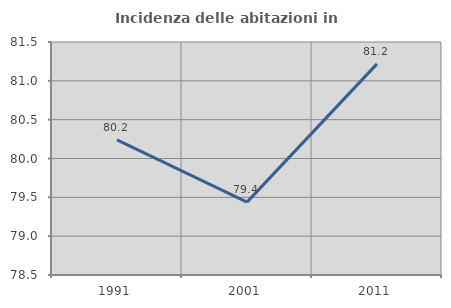
| Category | Incidenza delle abitazioni in proprietà  |
|---|---|
| 1991.0 | 80.239 |
| 2001.0 | 79.438 |
| 2011.0 | 81.218 |